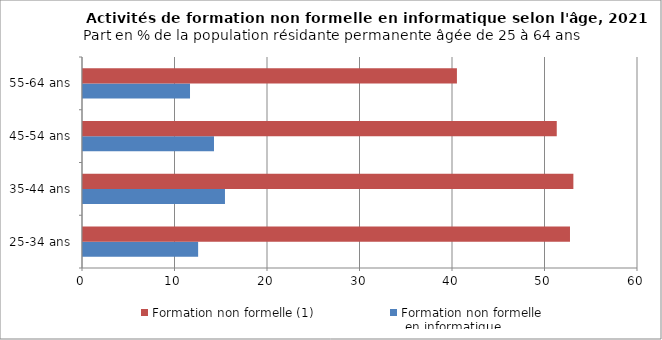
| Category | Formation non formelle
 en informatique | Formation non formelle (1) |
|---|---|---|
| 25-34 ans | 12.447 | 52.648 |
| 35-44 ans | 15.348 | 53.013 |
| 45-54 ans | 14.161 | 51.217 |
| 55-64 ans | 11.569 | 40.424 |